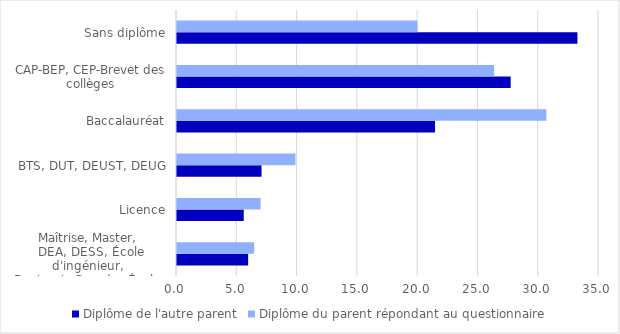
| Category | Diplôme de l'autre parent | Diplôme du parent répondant au questionnaire |
|---|---|---|
| Maîtrise, Master, 
DEA, DESS, École d'ingénieur, 
Doctorat, Grandes Écoles | 5.9 | 6.4 |
| Licence | 5.535 | 6.936 |
| BTS, DUT, DEUST, DEUG | 7.011 | 9.827 |
| Baccalauréat | 21.402 | 30.636 |
| CAP-BEP, CEP-Brevet des collèges | 27.675 | 26.301 |
| Sans diplôme | 33.21 | 19.942 |